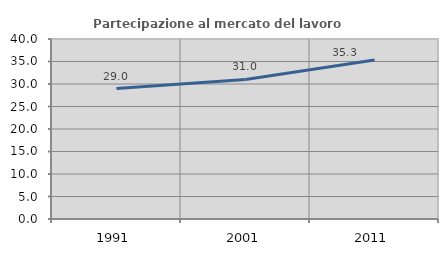
| Category | Partecipazione al mercato del lavoro  femminile |
|---|---|
| 1991.0 | 28.978 |
| 2001.0 | 31.016 |
| 2011.0 | 35.339 |